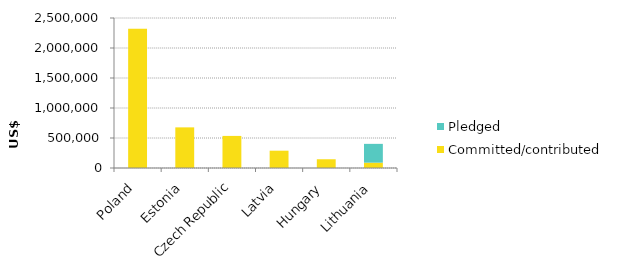
| Category | Committed/contributed | Pledged |
|---|---|---|
| Poland | 2320320 | 0 |
| Estonia | 677153 | 0 |
| Czech Republic | 534657 | 0 |
| Latvia | 288389 | 0 |
| Hungary | 145759 | 0 |
| Lithuania | 88904 | 313369 |